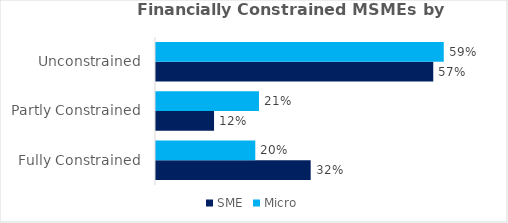
| Category | Male | Female |
|---|---|---|
| Fully Constrained | 0.197 | 0.242 |
| Partly Constrained | 0.242 | 0.145 |
| Unconstrained | 0.561 | 0.613 |